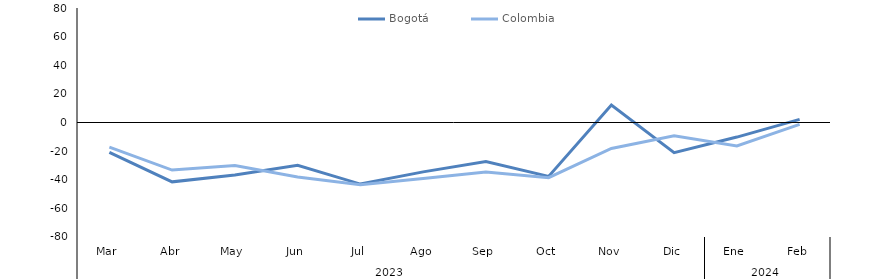
| Category | Bogotá | Colombia |
|---|---|---|
| 0 | -20.827 | -17.15 |
| 1 | -41.468 | -33.241 |
| 2 | -36.731 | -30.042 |
| 3 | -29.873 | -38.108 |
| 4 | -43.014 | -43.478 |
| 5 | -34.507 | -39.066 |
| 6 | -27.277 | -34.663 |
| 7 | -37.659 | -38.543 |
| 8 | 12.179 | -18.107 |
| 9 | -21.108 | -9.318 |
| 10 | -10.18 | -16.422 |
| 11 | 2.193 | -1.315 |